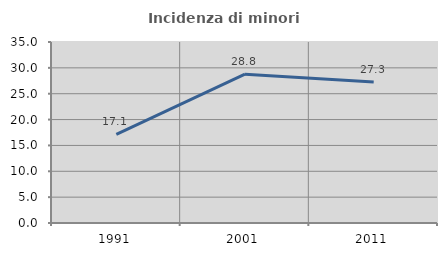
| Category | Incidenza di minori stranieri |
|---|---|
| 1991.0 | 17.143 |
| 2001.0 | 28.78 |
| 2011.0 | 27.286 |